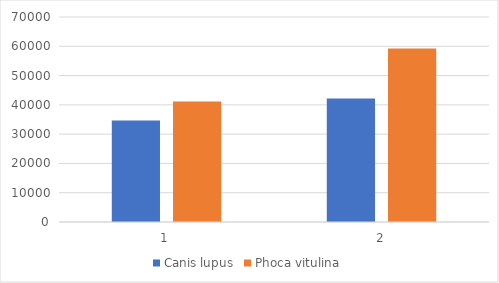
| Category | Canis lupus | Phoca vitulina |
|---|---|---|
| 0 | 34680 | 41157 |
| 1 | 42185 | 59221 |